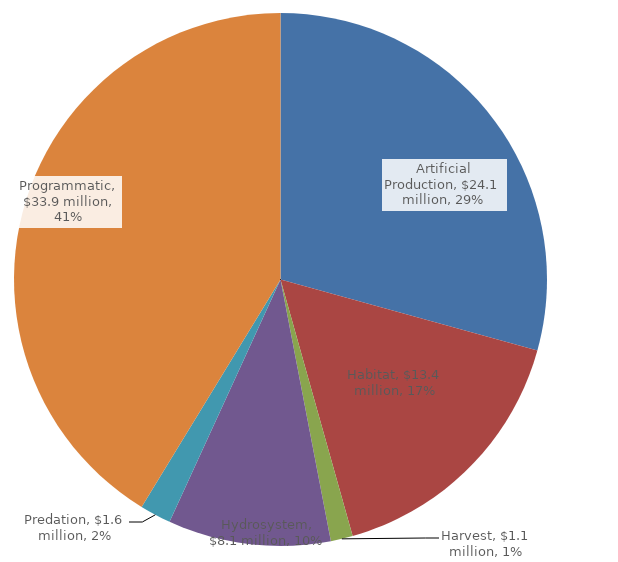
| Category | Series 0 |
|---|---|
| Artificial Production | 24079654.36 |
| Habitat | 13434942.03 |
| Harvest | 1098002.88 |
| Hydrosystem | 8107150.22 |
| Predation | 1553864.78 |
| Programmatic | 33928588.38 |